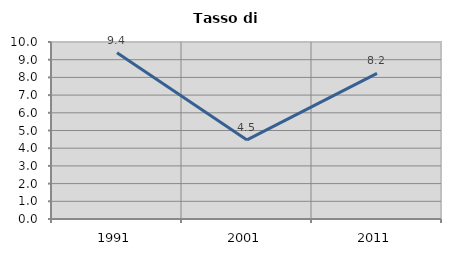
| Category | Tasso di disoccupazione   |
|---|---|
| 1991.0 | 9.397 |
| 2001.0 | 4.469 |
| 2011.0 | 8.225 |